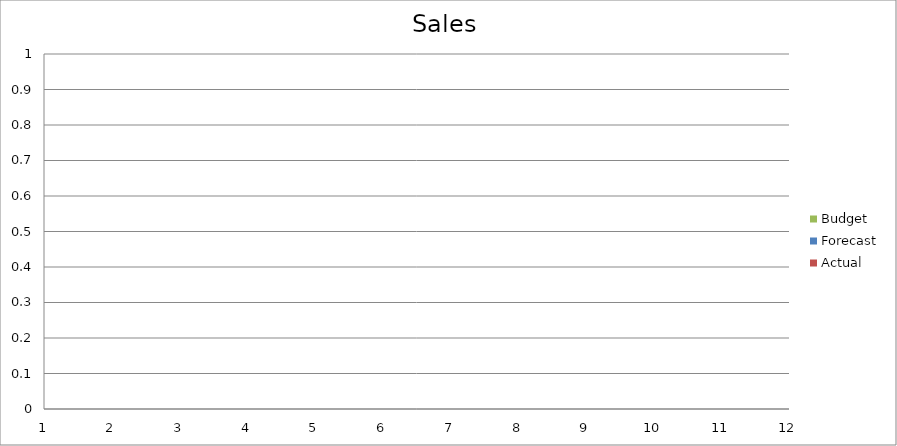
| Category | Budget | Forecast | Actual |
|---|---|---|---|
| 0 | 2950 | 2300 | 1600 |
| 1 | 1890 | 1220 | 3320 |
| 2 | 1560 | 1140 | 1890 |
| 3 | 600 | 890 | 1130 |
| 4 | 780 | 2140 | 1430 |
| 5 | 1460 | 810 | 2360 |
| 6 | 1660 | 2240 | 2800 |
| 7 | 840 | 1530 | 910 |
| 8 | 2380 | 2680 | 2200 |
| 9 | 1090 | 2360 | 2370 |
| 10 | 910 | 2960 | 2530 |
| 11 | 1400 | 1970 | 2670 |